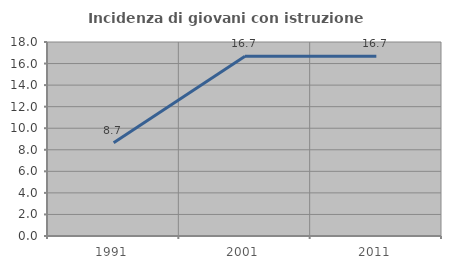
| Category | Incidenza di giovani con istruzione universitaria |
|---|---|
| 1991.0 | 8.654 |
| 2001.0 | 16.667 |
| 2011.0 | 16.667 |